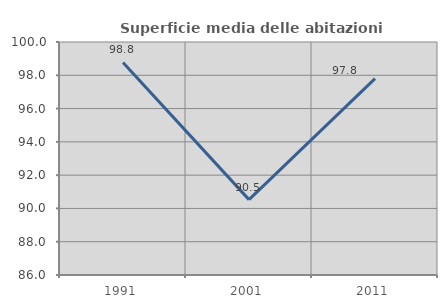
| Category | Superficie media delle abitazioni occupate |
|---|---|
| 1991.0 | 98.775 |
| 2001.0 | 90.528 |
| 2011.0 | 97.8 |